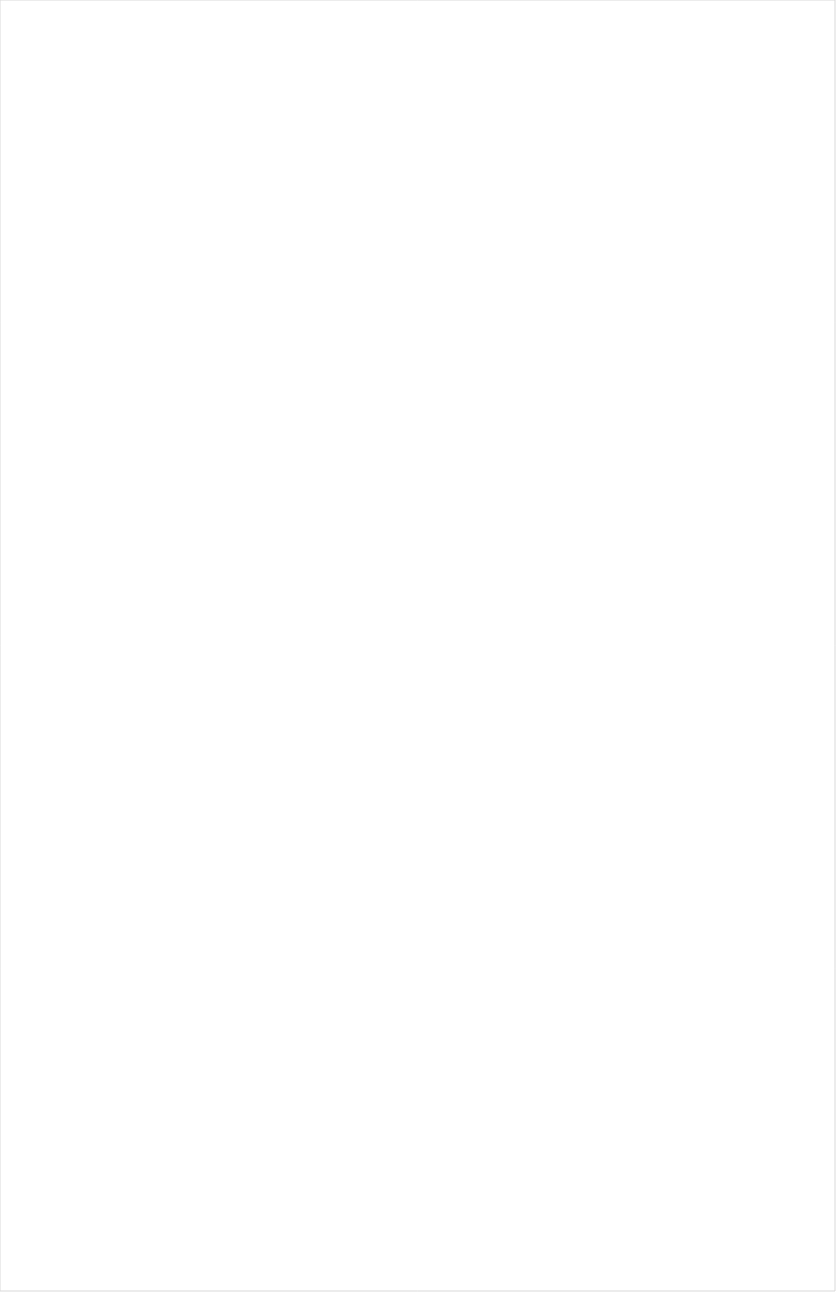
| Category | Total |
|---|---|
| Cartoon Network | -0.229 |
| Teen Nick | -0.209 |
| Nick Toons | -0.2 |
| Nick Jr. | -0.198 |
| Disney Junior US | -0.195 |
| Nick | -0.189 |
| VH1 | -0.184 |
| NBC Universo | -0.181 |
| TUDN | -0.181 |
| Univision | -0.171 |
| MTV | -0.168 |
| Telemundo | -0.165 |
| Galavision | -0.164 |
| Nick@Nite | -0.161 |
| Disney XD | -0.16 |
| UniMas | -0.154 |
| Adult Swim | -0.15 |
| Universal Kids | -0.145 |
| truTV | -0.14 |
| Disney Channel | -0.134 |
| BET | -0.13 |
| Comedy Central | -0.128 |
| FXX | -0.126 |
| TV ONE | -0.123 |
| NBA TV | -0.121 |
| Freeform | -0.115 |
| ESPN2 | -0.114 |
| Viceland | -0.107 |
| MTV2 | -0.106 |
| ESPN Deportes | -0.106 |
| E! | -0.094 |
| ESPN | -0.091 |
| BET Her | -0.082 |
| NFL Network | -0.081 |
| ESPNEWS | -0.078 |
| BRAVO | -0.077 |
| TNT | -0.073 |
| FX | -0.061 |
| Paramount Network | -0.061 |
| TBS | -0.047 |
| FXDEP | -0.047 |
| SYFY | -0.046 |
| Lifetime Movies | -0.044 |
| Discovery Family Channel | -0.038 |
| Independent Film (IFC) | -0.034 |
| USA Network | -0.032 |
| Lifetime | -0.031 |
| Discovery Life Channel | -0.027 |
| TLC | -0.025 |
| ESPNU | -0.021 |
| A&E | -0.02 |
| Cooking Channel | -0.016 |
| FX Movie Channel | -0.013 |
| WE TV | -0.013 |
| Food Network | -0.012 |
| Logo | -0.012 |
| MyNetworkTV | -0.01 |
| Travel | -0.007 |
| CMTV | -0.003 |
| Ovation | -0.003 |
| Reelz Channel | 0.001 |
| OXYGEN | 0.004 |
| FOX Sports 2 | 0.005 |
| AMC | 0.007 |
| Discovery Channel | 0.009 |
| Oprah Winfrey Network | 0.011 |
| FOX | 0.012 |
| CNBC | 0.013 |
| CBS Sports | 0.014 |
| Investigation Discovery | 0.014 |
| NBC Sports | 0.014 |
| Motor Trend Network | 0.025 |
| Fox Sports 1 | 0.027 |
| NHL | 0.028 |
| Headline News | 0.031 |
| MLB Network | 0.038 |
| Animal Planet | 0.041 |
| Destination America | 0.041 |
| CW | 0.043 |
| BBC America | 0.043 |
| UP TV | 0.05 |
| FYI | 0.051 |
| Game Show | 0.051 |
| ABC | 0.051 |
| POP | 0.053 |
| National Geographic | 0.054 |
| Olympic Channel | 0.055 |
| HGTV | 0.062 |
| ION | 0.064 |
| History Channel | 0.066 |
| The Sportsman Channel | 0.066 |
| NBC | 0.066 |
| Great American Country | 0.066 |
| Big Ten Network | 0.071 |
| TV LAND | 0.071 |
| CNN | 0.072 |
| Golf | 0.08 |
| WGN America | 0.081 |
| DIY | 0.089 |
| PAC-12 Network | 0.092 |
| Science Channel | 0.095 |
| Outdoor Channel | 0.096 |
| SundanceTV | 0.105 |
| American Heroes Channel | 0.112 |
| National Geographic Wild | 0.115 |
| CBS | 0.116 |
| Tennis Channel | 0.117 |
| Weather Channel | 0.126 |
| Bloomberg HD | 0.14 |
| Fox News | 0.151 |
| Hallmark | 0.161 |
| Smithsonian | 0.163 |
| MSNBC | 0.205 |
| INSP | 0.232 |
| Fox Business | 0.238 |
| Hallmark Movies & Mysteries | 0.242 |
| PBS | 0.254 |
| RFD TV | 0.303 |